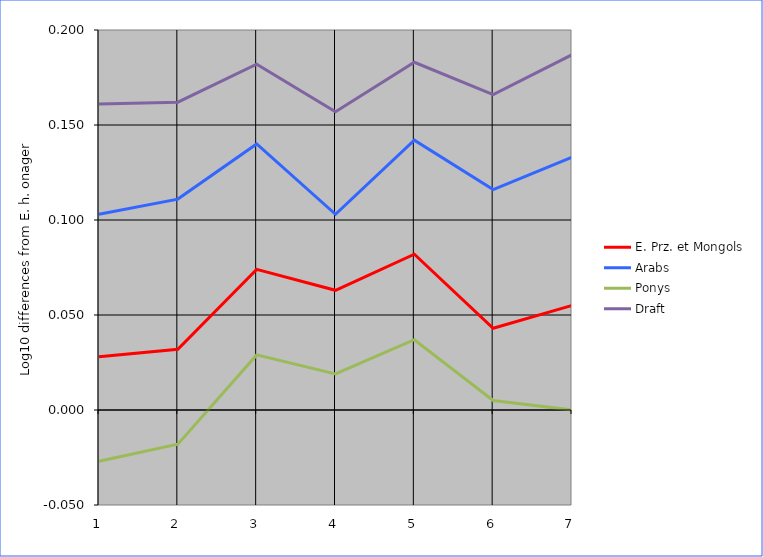
| Category | E. Prz. et Mongols | Arabs | Ponys | Draft |
|---|---|---|---|---|
| 1.0 | 0.028 | 0.103 | -0.027 | 0.161 |
| 2.0 | 0.032 | 0.111 | -0.018 | 0.162 |
| 3.0 | 0.074 | 0.14 | 0.029 | 0.182 |
| 4.0 | 0.063 | 0.103 | 0.019 | 0.157 |
| 5.0 | 0.082 | 0.142 | 0.037 | 0.183 |
| 6.0 | 0.043 | 0.116 | 0.005 | 0.166 |
| 7.0 | 0.055 | 0.133 | 0 | 0.187 |